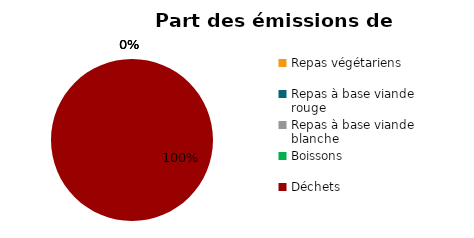
| Category | Series 0 |
|---|---|
| Repas végétariens | 0 |
| Repas à base viande rouge | 0 |
| Repas à base viande blanche | 0 |
| Boissons | 0 |
| Déchets | 200 |